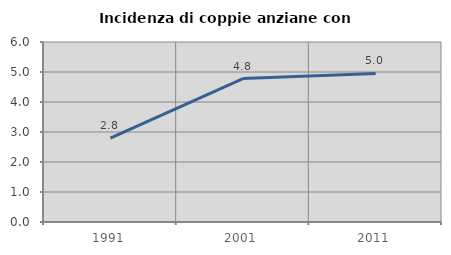
| Category | Incidenza di coppie anziane con figli |
|---|---|
| 1991.0 | 2.796 |
| 2001.0 | 4.78 |
| 2011.0 | 4.952 |